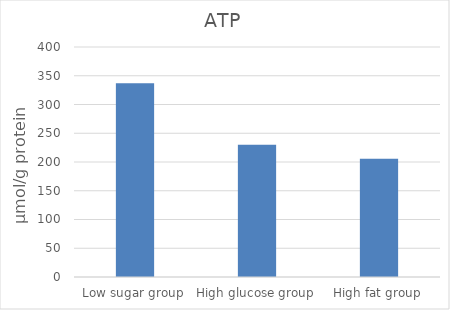
| Category | Series 0 |
|---|---|
| Low sugar group | 337.12 |
| High glucose group | 229.939 |
| High fat group | 205.64 |